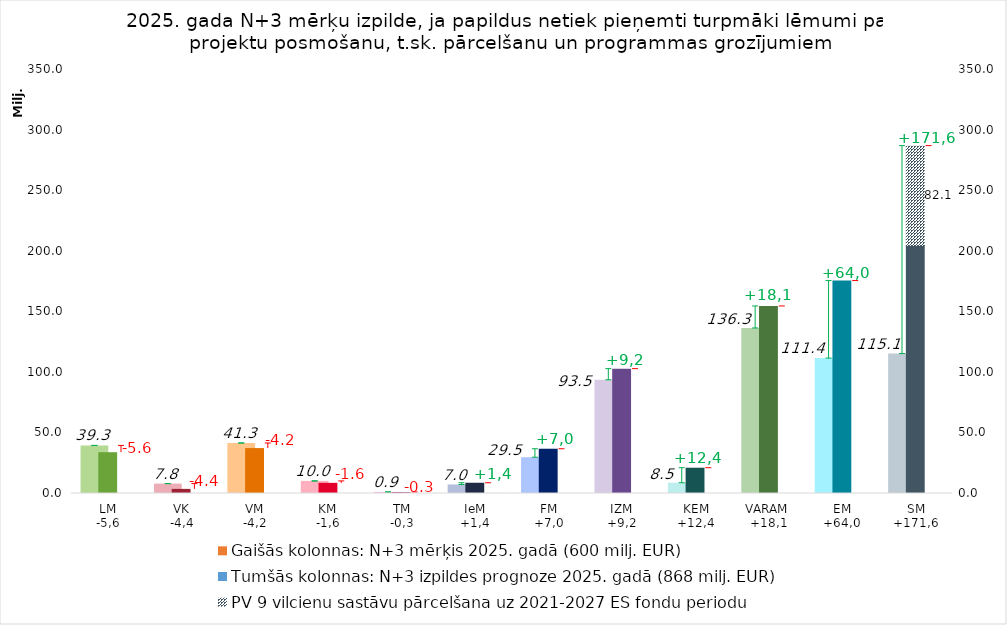
| Category | Gaišās kolonnas: N+3 mērķis 2025. gadā (600 milj. EUR) | Tehniska kolonna |
|---|---|---|
| LM
-5,6 | 39266646.043 | 33680836.688 |
| VK
-4,4 | 7775851.901 | 3398486.085 |
| VM
-4,2 | 41298760.952 | 37081893.88 |
| KM
-1,6 | 9979271.897 | 8386189.259 |
| TM
-0,3 | 869146.589 | 535441.044 |
| IeM
+1,4 | 7016443.369 | 8460676.874 |
| FM
+7,0 | 29542593.26 | 36535455.066 |
| IZM
+9,2 | 93478547.055 | 102655467.245 |
| KEM
+12,4 | 8477070.143 | 20882662.835 |
| VARAM 
+18,1 | 136252356.979 | 154400972.354 |
| EM
+64,0 | 111367703.566 | 175373476.777 |
| SM
+171,6 | 115107857.272 | 286747531.86 |